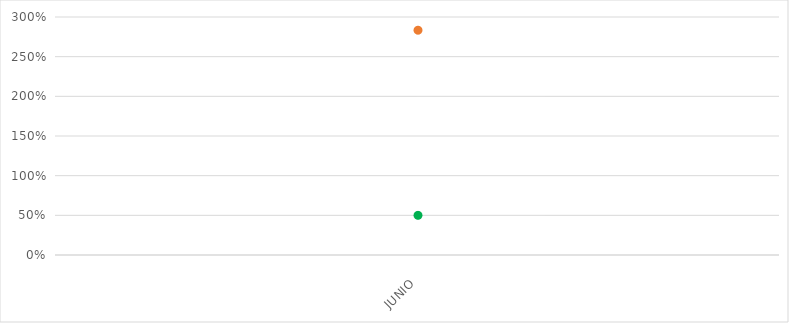
| Category | VALOR  | META PONDERADA |
|---|---|---|
| JUNIO | 2.833 | 0.5 |